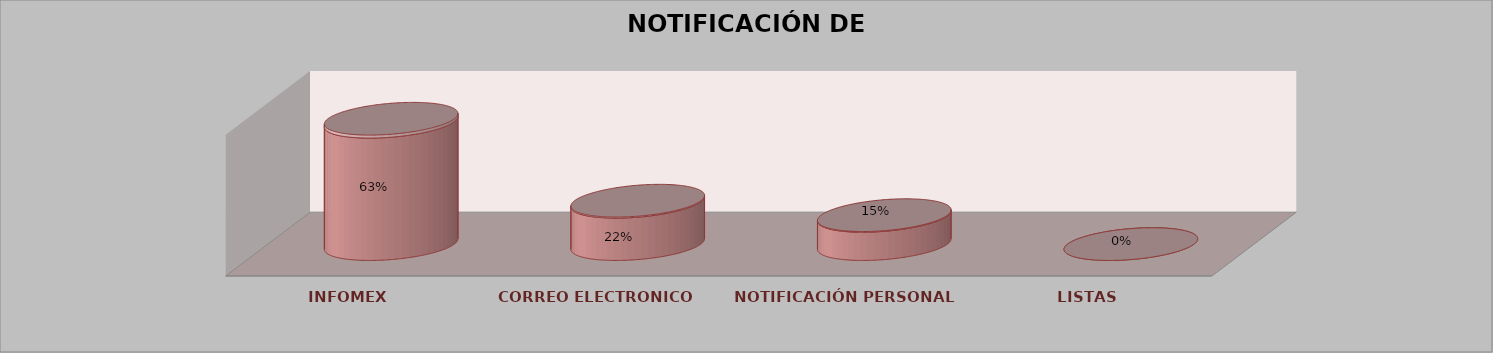
| Category | Series 0 | Series 1 | Series 2 | Series 3 | Series 4 |
|---|---|---|---|---|---|
| INFOMEX |  |  |  | 26 | 0.634 |
| CORREO ELECTRONICO |  |  |  | 9 | 0.22 |
| NOTIFICACIÓN PERSONAL |  |  |  | 6 | 0.146 |
| LISTAS |  |  |  | 0 | 0 |